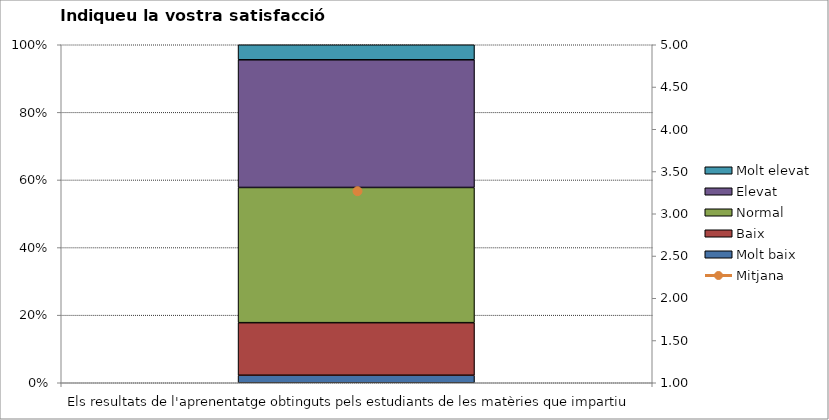
| Category | Molt baix | Baix | Normal  | Elevat | Molt elevat |
|---|---|---|---|---|---|
| Els resultats de l'aprenentatge obtinguts pels estudiants de les matèries que impartiu | 1 | 7 | 18 | 17 | 2 |